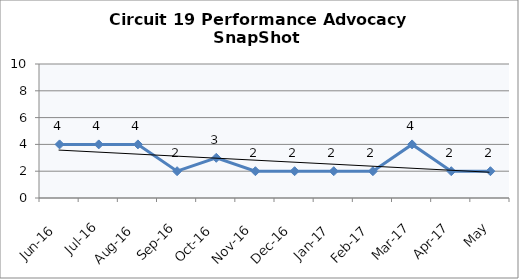
| Category | Circuit 19 |
|---|---|
| Jun-16 | 4 |
| Jul-16 | 4 |
| Aug-16 | 4 |
| Sep-16 | 2 |
| Oct-16 | 3 |
| Nov-16 | 2 |
| Dec-16 | 2 |
| Jan-17 | 2 |
| Feb-17 | 2 |
| Mar-17 | 4 |
| Apr-17 | 2 |
| May | 2 |